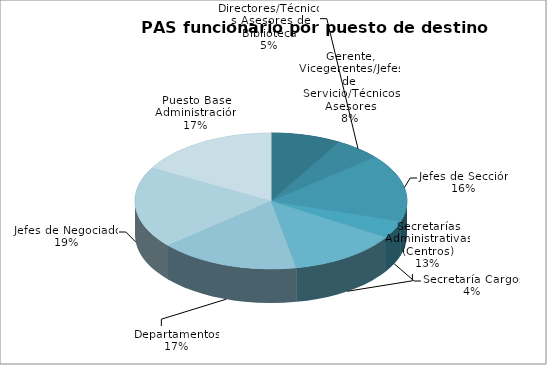
| Category | Series 0 |
|---|---|
| Gerente, Vicegerentes/Jefes de Servicio/Técnicos Asesores | 35 |
| Directores/Técnicos Asesores de Biblioteca | 23 |
| Jefes de Sección | 68 |
| Secretaría Cargos | 17 |
| Secretarías Administrativas (Centros) | 55 |
| Departamentos | 70 |
| Jefes de Negociado | 82 |
| Puesto Base Administración | 71 |